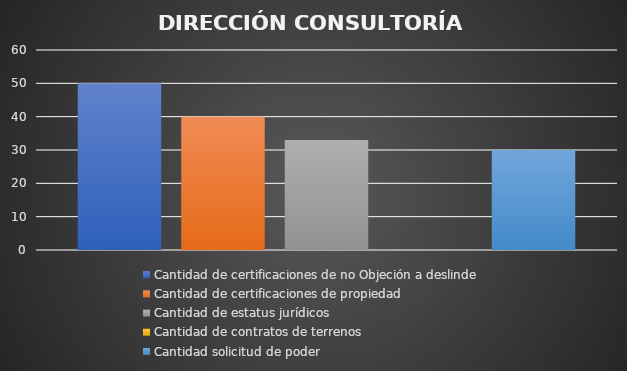
| Category | Cantidad de certificaciones de no Objeción a deslinde | Cantidad de certificaciones de propiedad | Cantidad de estatus jurídicos | Cantidad de contratos de terrenos | Cantidad solicitud de poder  |
|---|---|---|---|---|---|
| 0 | 50 | 40 | 33 | 0 | 30 |